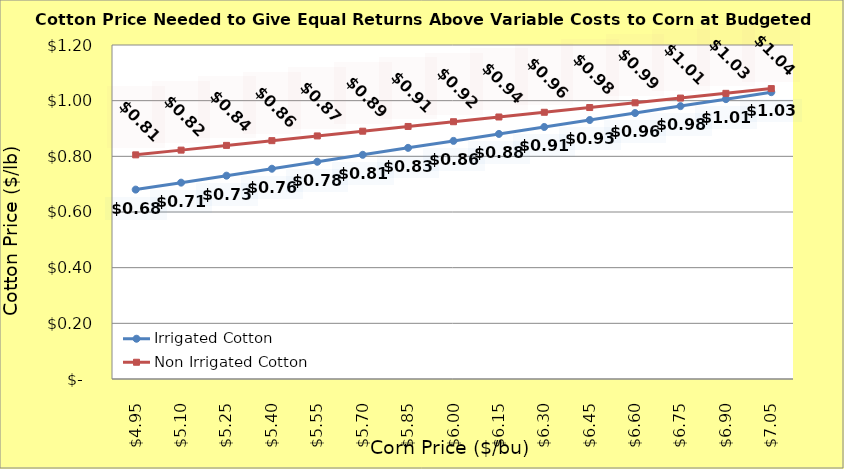
| Category | Irrigated Cotton | Non Irrigated Cotton |
|---|---|---|
| 4.9499999999999975 | 0.68 | 0.805 |
| 5.099999999999998 | 0.705 | 0.822 |
| 5.249999999999998 | 0.73 | 0.839 |
| 5.399999999999999 | 0.755 | 0.856 |
| 5.549999999999999 | 0.78 | 0.873 |
| 5.699999999999999 | 0.805 | 0.89 |
| 5.85 | 0.83 | 0.907 |
| 6.0 | 0.855 | 0.924 |
| 6.15 | 0.88 | 0.941 |
| 6.300000000000001 | 0.905 | 0.958 |
| 6.450000000000001 | 0.93 | 0.975 |
| 6.600000000000001 | 0.955 | 0.992 |
| 6.750000000000002 | 0.98 | 1.009 |
| 6.900000000000002 | 1.005 | 1.026 |
| 7.0500000000000025 | 1.03 | 1.043 |